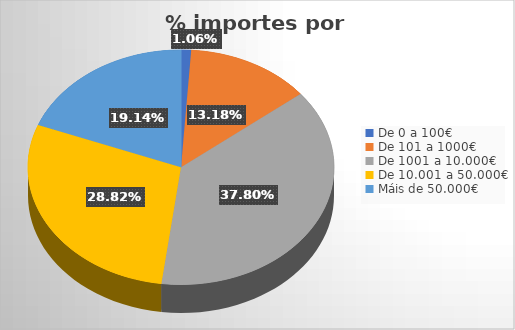
| Category | Local | Rexional | Nacional | Estranxeiro | Total |
|---|---|---|---|---|---|
| De 0 a 100€ | 0.011 | 0.001 | 0.003 | 0 | 0.011 |
| De 101 a 1000€ | 0.132 | 0.013 | 0.037 | 0.007 | 0.132 |
| De 1001 a 10.000€ | 0.378 | 0.06 | 0.125 | 0.018 | 0.378 |
| De 10.001 a 50.000€ | 0.288 | 0.019 | 0.145 | 0.015 | 0.288 |
| Máis de 50.000€ | 0.191 | 0.002 | 0.155 | 0 | 0.191 |